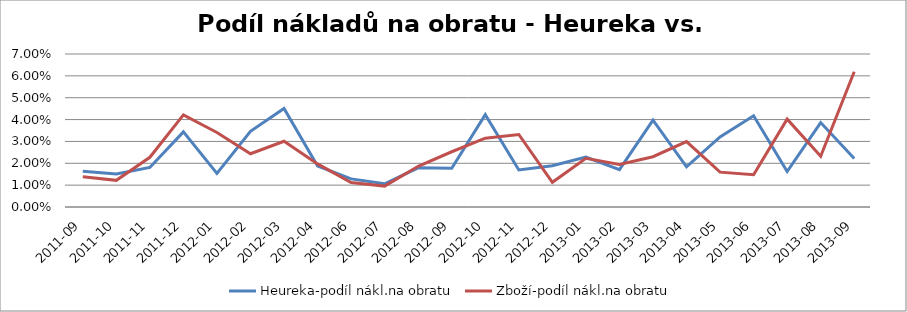
| Category | Heureka-podíl nákl.na obratu | Zboží-podíl nákl.na obratu |
|---|---|---|
| 2011-09 | 0.016 | 0.014 |
| 2011-10 | 0.015 | 0.012 |
| 2011-11 | 0.018 | 0.023 |
| 2011-12 | 0.034 | 0.042 |
| 2012-01 | 0.015 | 0.034 |
| 2012-02 | 0.035 | 0.024 |
| 2012-03 | 0.045 | 0.03 |
| 2012-04 | 0.019 | 0.02 |
| 2012-06 | 0.013 | 0.011 |
| 2012-07 | 0.011 | 0.01 |
| 2012-08 | 0.018 | 0.019 |
| 2012-09 | 0.018 | 0.025 |
| 2012-10 | 0.042 | 0.031 |
| 2012-11 | 0.017 | 0.033 |
| 2012-12 | 0.019 | 0.011 |
| 2013-01 | 0.023 | 0.022 |
| 2013-02 | 0.017 | 0.019 |
| 2013-03 | 0.04 | 0.023 |
| 2013-04 | 0.018 | 0.03 |
| 2013-05 | 0.032 | 0.016 |
| 2013-06 | 0.042 | 0.015 |
| 2013-07 | 0.016 | 0.04 |
| 2013-08 | 0.039 | 0.023 |
| 2013-09 | 0.022 | 0.062 |